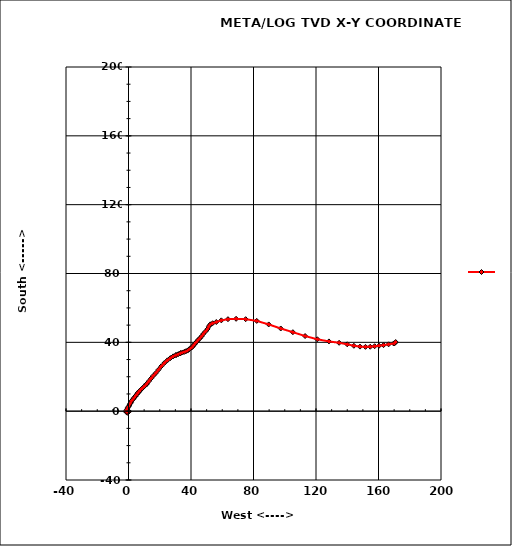
| Category | Series 0 |
|---|---|
| 0.0 | 0 |
| 0.0 | 0 |
| 0.013965185908719738 | -0.006 |
| 0.027930371817439476 | -0.012 |
| 0.041895557726159216 | -0.017 |
| 0.05586074363487896 | -0.023 |
| 0.0698259295435987 | -0.029 |
| 0.08379111545231845 | -0.035 |
| 0.09775630136103819 | -0.04 |
| 0.11172148726975793 | -0.046 |
| -0.2058657351733637 | -0.683 |
| -0.702585359210208 | -0.97 |
| -1.1266549915286492 | -0.662 |
| -1.5507246238470904 | -0.354 |
| -1.3293430640074384 | 0.328 |
| -0.964270823102273 | 1.093 |
| -0.4439738167978182 | 1.926 |
| 0.07632318950663652 | 2.758 |
| 0.5966201958110913 | 3.591 |
| 1.116917202115546 | 4.423 |
| 1.6372142084200008 | 5.256 |
| 2.1575112147244555 | 6.089 |
| 2.8879303756338577 | 6.929 |
| 3.61834953654326 | 7.769 |
| 4.440369485261798 | 8.715 |
| 4.440369485261798 | 8.715 |
| 5.343174369826439 | 9.772 |
| 6.24597925439108 | 10.829 |
| 6.24597925439108 | 10.829 |
| 7.304229898974679 | 11.906 |
| 8.615191164608094 | 13.107 |
| 10.164916974648698 | 14.478 |
| 11.714642784689302 | 15.849 |
| 11.714642784689302 | 15.849 |
| 13.031951343151459 | 17.419 |
| 14.485911561799153 | 19.034 |
| 15.939871780446847 | 20.649 |
| 17.607116673360316 | 22.259 |
| 19.2316854145299 | 24.095 |
| 20.953943419207263 | 26.076 |
| 22.907445994144563 | 27.963 |
| 24.884707814833817 | 29.536 |
| 26.796738712763464 | 30.85 |
| 28.633137365498065 | 31.868 |
| 30.401749088444532 | 32.618 |
| 30.401749088444532 | 32.618 |
| 31.880734856752994 | 33.171 |
| 33.359720625061456 | 33.724 |
| 33.359720625061456 | 33.724 |
| 34.56484107338131 | 34.104 |
| 35.76996152170116 | 34.484 |
| 36.80578214063005 | 34.851 |
| 37.84160275955894 | 35.218 |
| 38.701570916138195 | 35.902 |
| 39.64351408773934 | 36.502 |
| 40.58545725934049 | 37.102 |
| 41.36309386191648 | 37.907 |
| 42.18225708942178 | 38.833 |
| 43.04560835332796 | 39.743 |
| 43.90895961723413 | 40.653 |
| 44.77231088114031 | 41.563 |
| 45.75884144203979 | 42.42 |
| 46.792233331551316 | 43.528 |
| 47.86090270063745 | 44.872 |
| 49.255174956063215 | 46.291 |
| 50.6328645244252 | 47.794 |
| 51.48060175141947 | 49.355 |
| 52.39655915575865 | 50.467 |
| 53.85248959425663 | 51.1 |
| 56.18951107819585 | 51.814 |
| 59.41858134395589 | 52.771 |
| 63.65588084225032 | 53.442 |
| 68.8607191515023 | 53.669 |
| 74.98193716470824 | 53.455 |
| 82.07164696107604 | 52.459 |
| 89.73413164183248 | 50.406 |
| 97.43159080145863 | 48.052 |
| 105.20813581257899 | 45.896 |
| 113.02274795172578 | 43.655 |
| 120.85814150887275 | 41.774 |
| 128.28981939554703 | 40.53 |
| 134.8079664830994 | 39.73 |
| 139.99734487529506 | 38.861 |
| 144.25320093071377 | 37.996 |
| 148.16857270360546 | 37.515 |
| 151.66543503568843 | 37.362 |
| 154.71109678437554 | 37.442 |
| 157.53103043686923 | 37.738 |
| 160.35096408936292 | 38.035 |
| 163.2206382457788 | 38.362 |
| 166.47576166213582 | 38.848 |
| 169.73088507849286 | 39.335 |
| 170.2011145672681 | 39.372 |
| 170.99193655458248 | 40.162 |